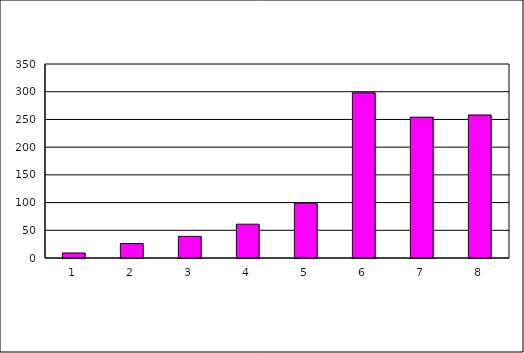
| Category | Series 0 |
|---|---|
| 0 | 9 |
| 1 | 26 |
| 2 | 39 |
| 3 | 61 |
| 4 | 99 |
| 5 | 298 |
| 6 | 254 |
| 7 | 258 |